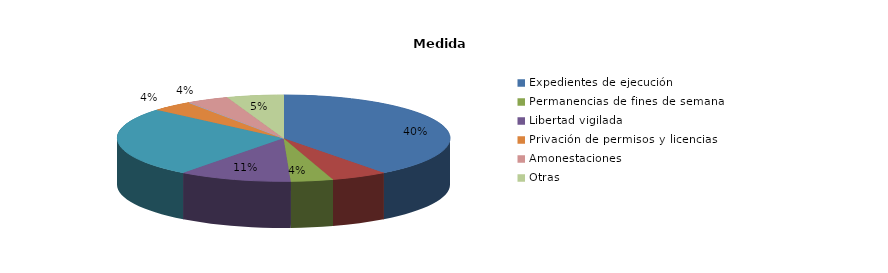
| Category | Series 0 |
|---|---|
| Expedientes de ejecución | 29 |
| Internamientos | 4 |
| Permanencias de fines de semana | 3 |
| Libertad vigilada | 8 |
| Prestaciones en beneficio de la comunidad | 19 |
| Privación de permisos y licencias | 3 |
| Convivencia Familiar Educativa | 0 |
| Amonestaciones | 3 |
| Otras | 4 |